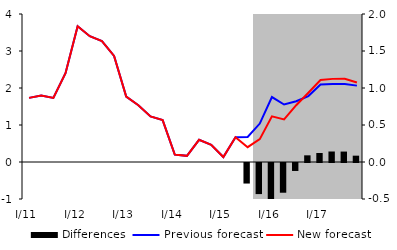
| Category | Differences |
|---|---|
| 0 | 0 |
| 1 | 0 |
| 2 | 0 |
| 3 | 0 |
| 4 | 0 |
| 5 | 0 |
| 6 | 0 |
| 7 | 0 |
| 8 | 0 |
| 9 | 0 |
| 10 | 0 |
| 11 | 0 |
| 12 | 0 |
| 13 | 0 |
| 14 | 0 |
| 15 | 0 |
| 16 | 0 |
| 17 | 0 |
| 18 | -0.278 |
| 19 | -0.42 |
| 20 | -0.522 |
| 21 | -0.402 |
| 22 | -0.108 |
| 23 | 0.09 |
| 24 | 0.122 |
| 25 | 0.142 |
| 26 | 0.141 |
| 27 | 0.086 |